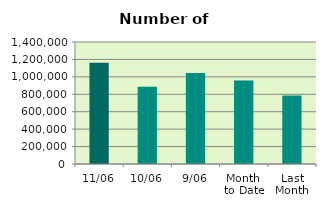
| Category | Series 0 |
|---|---|
| 11/06 | 1163258 |
| 10/06 | 885928 |
| 9/06 | 1044424 |
| Month 
to Date | 958098.667 |
| Last
Month | 785067 |